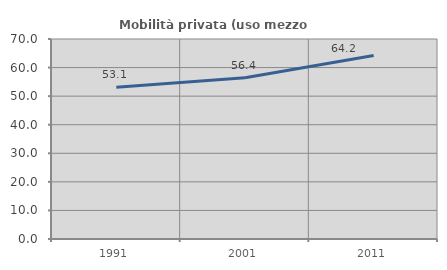
| Category | Mobilità privata (uso mezzo privato) |
|---|---|
| 1991.0 | 53.11 |
| 2001.0 | 56.425 |
| 2011.0 | 64.189 |